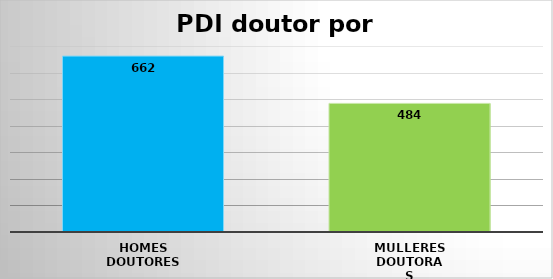
| Category | Series 0 |
|---|---|
| Homes
doutores | 662 |
| Mulleres
doutoras | 484 |